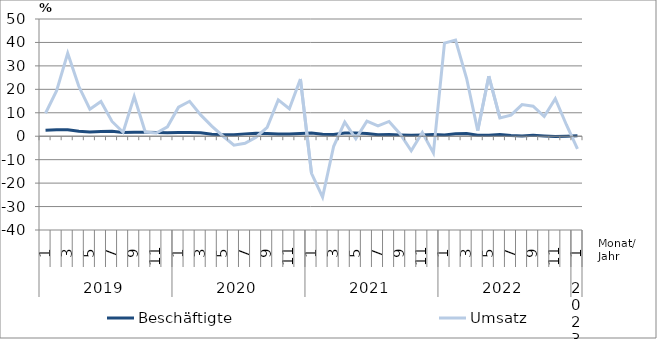
| Category | Beschäftigte | Umsatz |
|---|---|---|
| 0 | 2.6 | 9.8 |
| 1 | 2.8 | 19.4 |
| 2 | 2.8 | 35.4 |
| 3 | 2.1 | 21.3 |
| 4 | 1.8 | 11.5 |
| 5 | 2 | 14.8 |
| 6 | 2.1 | 6.3 |
| 7 | 1.6 | 1.7 |
| 8 | 1.7 | 16.9 |
| 9 | 1.7 | 1.8 |
| 10 | 1.6 | 1.4 |
| 11 | 1.5 | 4 |
| 12 | 1.6 | 12.4 |
| 13 | 1.6 | 14.9 |
| 14 | 1.5 | 9.1 |
| 15 | 0.8 | 4.3 |
| 16 | 0.6 | 0.1 |
| 17 | 0.6 | -3.8 |
| 18 | 1 | -3 |
| 19 | 1.3 | -0.4 |
| 20 | 1.2 | 3.8 |
| 21 | 1 | 15.5 |
| 22 | 1 | 11.7 |
| 23 | 1.2 | 24.4 |
| 24 | 1.4 | -15.8 |
| 25 | 0.8 | -26 |
| 26 | 0.7 | -4.3 |
| 27 | 1.4 | 6 |
| 28 | 1.4 | -1.1 |
| 29 | 1.2 | 6.4 |
| 30 | 0.6 | 4.4 |
| 31 | 0.7 | 6.3 |
| 32 | 0.5 | 1 |
| 33 | 0.4 | -6.2 |
| 34 | 0.5 | 1.6 |
| 35 | 0.7 | -7.1 |
| 36 | 0.5 | 39.7 |
| 37 | 1.1 | 41 |
| 38 | 1.2 | 24.6 |
| 39 | 0.4 | 2.4 |
| 40 | 0.4 | 25.6 |
| 41 | 0.7 | 7.8 |
| 42 | 0.3 | 9 |
| 43 | 0.1 | 13.5 |
| 44 | 0.4 | 12.8 |
| 45 | 0.1 | 8.4 |
| 46 | -0.1 | 16 |
| 47 | 0 | 4.9 |
| 48 | 0.2 | -5.4 |